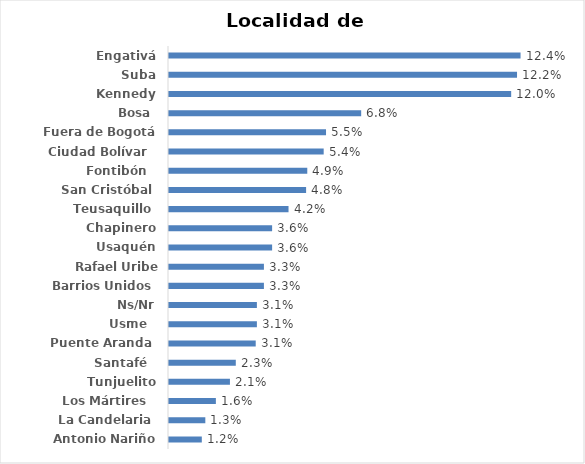
| Category | Series 0 |
|---|---|
| Antonio Nariño | 0.012 |
| La Candelaria  | 0.013 |
| Los Mártires   | 0.016 |
| Tunjuelito | 0.021 |
| Santafé   | 0.023 |
| Puente Aranda  | 0.031 |
| Usme   | 0.031 |
| Ns/Nr | 0.031 |
| Barrios Unidos  | 0.033 |
| Rafael Uribe Uribe  | 0.033 |
| Usaquén | 0.036 |
| Chapinero | 0.036 |
| Teusaquillo  | 0.042 |
| San Cristóbal  | 0.048 |
| Fontibón   | 0.049 |
| Ciudad Bolívar   | 0.054 |
| Fuera de Bogotá | 0.055 |
| Bosa  | 0.068 |
| Kennedy | 0.12 |
| Suba | 0.122 |
| Engativá | 0.124 |